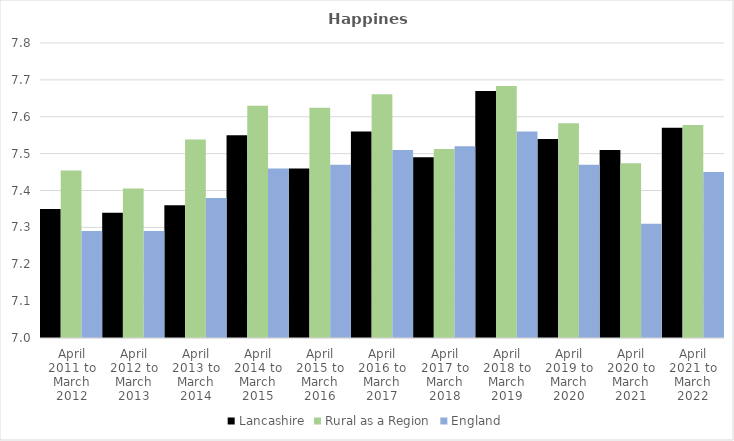
| Category | Lancashire | Rural as a Region | England |
|---|---|---|---|
| April 2011 to March 2012 | 7.35 | 7.454 | 7.29 |
| April 2012 to March 2013 | 7.34 | 7.406 | 7.29 |
| April 2013 to March 2014 | 7.36 | 7.539 | 7.38 |
| April 2014 to March 2015 | 7.55 | 7.63 | 7.46 |
| April 2015 to March 2016 | 7.46 | 7.625 | 7.47 |
| April 2016 to March 2017 | 7.56 | 7.661 | 7.51 |
| April 2017 to March 2018 | 7.49 | 7.513 | 7.52 |
| April 2018 to March 2019 | 7.67 | 7.684 | 7.56 |
| April 2019 to March 2020 | 7.54 | 7.582 | 7.47 |
| April 2020 to March 2021 | 7.51 | 7.474 | 7.31 |
| April 2021 to March 2022 | 7.57 | 7.577 | 7.45 |